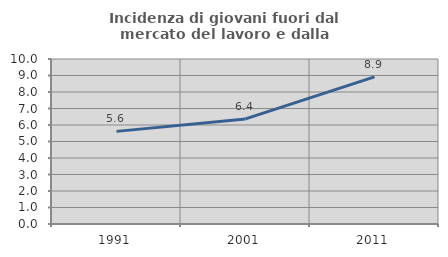
| Category | Incidenza di giovani fuori dal mercato del lavoro e dalla formazione  |
|---|---|
| 1991.0 | 5.614 |
| 2001.0 | 6.371 |
| 2011.0 | 8.917 |